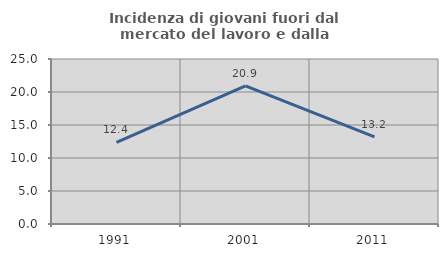
| Category | Incidenza di giovani fuori dal mercato del lavoro e dalla formazione  |
|---|---|
| 1991.0 | 12.367 |
| 2001.0 | 20.919 |
| 2011.0 | 13.201 |